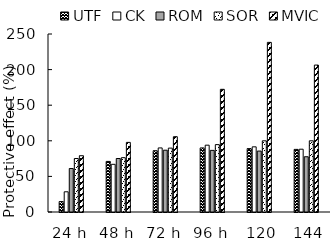
| Category | UTF | CK | ROM | SOR | MVIC |
|---|---|---|---|---|---|
| 24 h | 14.631 | 28.377 | 61.076 | 75.131 | 79.034 |
| 48 h | 71.052 | 66.966 | 75.136 | 76.284 | 97.776 |
| 72 h | 86.035 | 89.98 | 86.789 | 89.73 | 105.767 |
| 96 h | 89.975 | 93.84 | 86.53 | 94.643 | 172.313 |
| 120 h | 89.049 | 91.53 | 85.566 | 100 | 238.253 |
| 144 h | 87.948 | 88.193 | 77.62 | 100 | 206.369 |